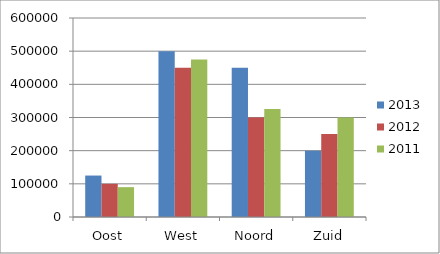
| Category | 2013 | 2012 | 2011 |
|---|---|---|---|
| Oost | 125000 | 100000 | 90000 |
| West | 500000 | 450000 | 475000 |
| Noord | 450000 | 300000 | 325751 |
| Zuid | 200000 | 250000 | 300000 |